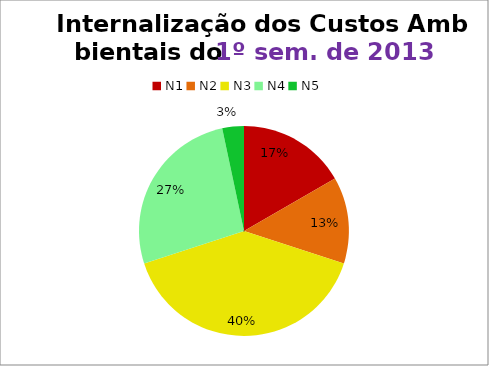
| Category | 1º/13 |
|---|---|
| N1 | 5 |
| N2 | 4 |
| N3 | 12 |
| N4 | 8 |
| N5 | 1 |